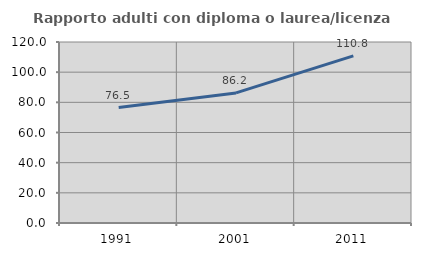
| Category | Rapporto adulti con diploma o laurea/licenza media  |
|---|---|
| 1991.0 | 76.543 |
| 2001.0 | 86.235 |
| 2011.0 | 110.757 |